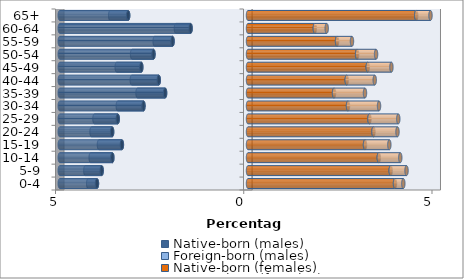
| Category | Native-born (males) | Foreign-born (males) | Native-born (females) | Foreign-born (females) |
|---|---|---|---|---|
| 0-4 | -4.012 | -0.234 | 3.905 | 0.221 |
| 5-9 | -3.886 | -0.435 | 3.79 | 0.421 |
| 10-14 | -3.603 | -0.576 | 3.474 | 0.571 |
| 15-19 | -3.349 | -0.61 | 3.108 | 0.646 |
| 20-24 | -3.609 | -0.547 | 3.333 | 0.638 |
| 25-29 | -3.459 | -0.619 | 3.226 | 0.766 |
| 30-34 | -2.776 | -0.682 | 2.656 | 0.824 |
| 35-39 | -2.202 | -0.732 | 2.286 | 0.822 |
| 40-44 | -2.37 | -0.717 | 2.622 | 0.744 |
| 45-49 | -2.834 | -0.654 | 3.18 | 0.629 |
| 50-54 | -2.511 | -0.568 | 2.898 | 0.504 |
| 55-59 | -2.003 | -0.475 | 2.365 | 0.397 |
| 60-64 | -1.524 | -0.39 | 1.775 | 0.316 |
| 65+ | -3.183 | -0.478 | 4.468 | 0.379 |